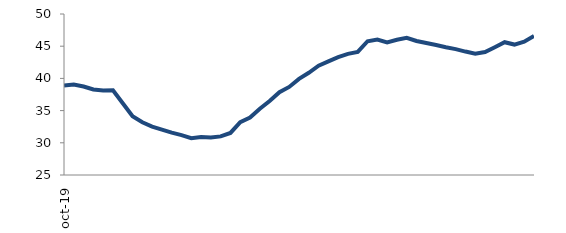
| Category | Series 0 |
|---|---|
| 2019-10-01 | 38.876 |
| 2019-11-01 | 39.061 |
| 2019-12-01 | 38.744 |
| 2020-01-01 | 38.288 |
| 2020-02-01 | 38.128 |
| 2020-03-01 | 38.143 |
| 2020-04-01 | 36.141 |
| 2020-05-01 | 34.114 |
| 2020-06-01 | 33.191 |
| 2020-07-01 | 32.506 |
| 2020-08-01 | 32.045 |
| 2020-09-01 | 31.572 |
| 2020-10-01 | 31.184 |
| 2020-11-01 | 30.726 |
| 2020-12-01 | 30.899 |
| 2021-01-01 | 30.834 |
| 2021-02-01 | 30.995 |
| 2021-03-01 | 31.535 |
| 2021-04-01 | 33.22 |
| 2021-05-01 | 33.912 |
| 2021-06-01 | 35.282 |
| 2021-07-01 | 36.501 |
| 2021-08-01 | 37.863 |
| 2021-09-01 | 38.674 |
| 2021-10-01 | 39.929 |
| 2021-11-01 | 40.877 |
| 2021-12-01 | 41.971 |
| 2022-01-01 | 42.648 |
| 2022-02-01 | 43.291 |
| 2022-03-01 | 43.809 |
| 2022-04-01 | 44.109 |
| 2022-05-01 | 45.766 |
| 2022-06-01 | 46.018 |
| 2022-07-01 | 45.603 |
| 2022-08-01 | 45.994 |
| 2022-09-01 | 46.295 |
| 2022-10-01 | 45.815 |
| 2022-11-01 | 45.487 |
| 2022-12-01 | 45.174 |
| 2023-01-01 | 44.844 |
| 2023-02-01 | 44.552 |
| 2023-03-01 | 44.166 |
| 2023-04-01 | 43.838 |
| 2023-05-01 | 44.095 |
| 2023-06-01 | 44.849 |
| 2023-07-01 | 45.617 |
| 2023-08-01 | 45.254 |
| 2023-09-01 | 45.708 |
| 2023-10-01 | 46.603 |